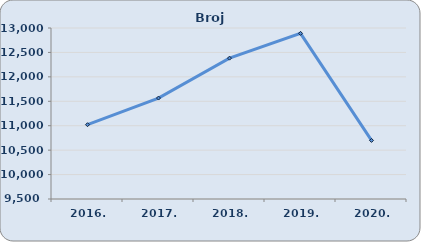
| Category | Broj zaposlenih |
|---|---|
| 2016. | 11021 |
| 2017. | 11566 |
| 2018. | 12383 |
| 2019. | 12890 |
| 2020. | 10699 |